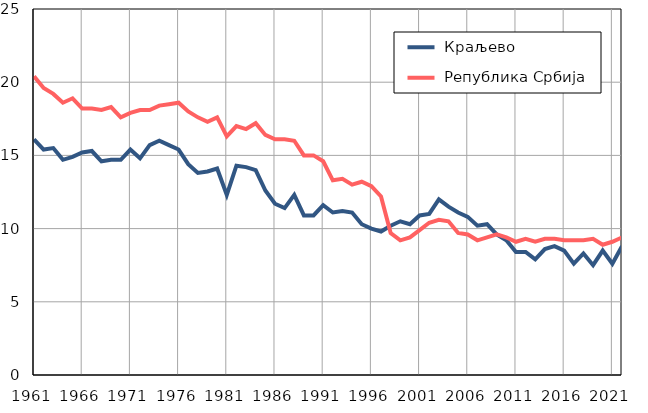
| Category |  Краљево |  Република Србија |
|---|---|---|
| 1961.0 | 16.1 | 20.4 |
| 1962.0 | 15.4 | 19.6 |
| 1963.0 | 15.5 | 19.2 |
| 1964.0 | 14.7 | 18.6 |
| 1965.0 | 14.9 | 18.9 |
| 1966.0 | 15.2 | 18.2 |
| 1967.0 | 15.3 | 18.2 |
| 1968.0 | 14.6 | 18.1 |
| 1969.0 | 14.7 | 18.3 |
| 1970.0 | 14.7 | 17.6 |
| 1971.0 | 15.4 | 17.9 |
| 1972.0 | 14.8 | 18.1 |
| 1973.0 | 15.7 | 18.1 |
| 1974.0 | 16 | 18.4 |
| 1975.0 | 15.7 | 18.5 |
| 1976.0 | 15.4 | 18.6 |
| 1977.0 | 14.4 | 18 |
| 1978.0 | 13.8 | 17.6 |
| 1979.0 | 13.9 | 17.3 |
| 1980.0 | 14.1 | 17.6 |
| 1981.0 | 12.3 | 16.3 |
| 1982.0 | 14.3 | 17 |
| 1983.0 | 14.2 | 16.8 |
| 1984.0 | 14 | 17.2 |
| 1985.0 | 12.6 | 16.4 |
| 1986.0 | 11.7 | 16.1 |
| 1987.0 | 11.4 | 16.1 |
| 1988.0 | 12.3 | 16 |
| 1989.0 | 10.9 | 15 |
| 1990.0 | 10.9 | 15 |
| 1991.0 | 11.6 | 14.6 |
| 1992.0 | 11.1 | 13.3 |
| 1993.0 | 11.2 | 13.4 |
| 1994.0 | 11.1 | 13 |
| 1995.0 | 10.3 | 13.2 |
| 1996.0 | 10 | 12.9 |
| 1997.0 | 9.8 | 12.2 |
| 1998.0 | 10.2 | 9.7 |
| 1999.0 | 10.5 | 9.2 |
| 2000.0 | 10.3 | 9.4 |
| 2001.0 | 10.9 | 9.9 |
| 2002.0 | 11 | 10.4 |
| 2003.0 | 12 | 10.6 |
| 2004.0 | 11.5 | 10.5 |
| 2005.0 | 11.1 | 9.7 |
| 2006.0 | 10.8 | 9.6 |
| 2007.0 | 10.2 | 9.2 |
| 2008.0 | 10.3 | 9.4 |
| 2009.0 | 9.6 | 9.6 |
| 2010.0 | 9.2 | 9.4 |
| 2011.0 | 8.4 | 9.1 |
| 2012.0 | 8.4 | 9.3 |
| 2013.0 | 7.9 | 9.1 |
| 2014.0 | 8.6 | 9.3 |
| 2015.0 | 8.8 | 9.3 |
| 2016.0 | 8.5 | 9.2 |
| 2017.0 | 7.6 | 9.2 |
| 2018.0 | 8.3 | 9.2 |
| 2019.0 | 7.5 | 9.3 |
| 2020.0 | 8.5 | 8.9 |
| 2021.0 | 7.6 | 9.1 |
| 2022.0 | 8.8 | 9.4 |